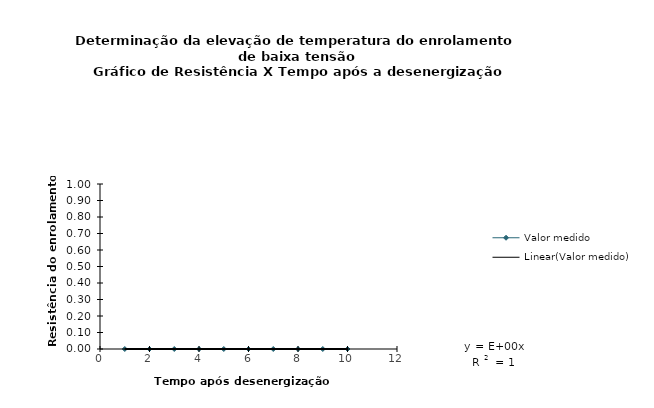
| Category | Valor medido |
|---|---|
| 0.0 | 0 |
| 0.0 | 0 |
| 0.0 | 0 |
| 0.0 | 0 |
| 0.0 | 0 |
| 0.0 | 0 |
| 0.0 | 0 |
| 0.0 | 0 |
| 0.0 | 0 |
| 0.0 | 0 |